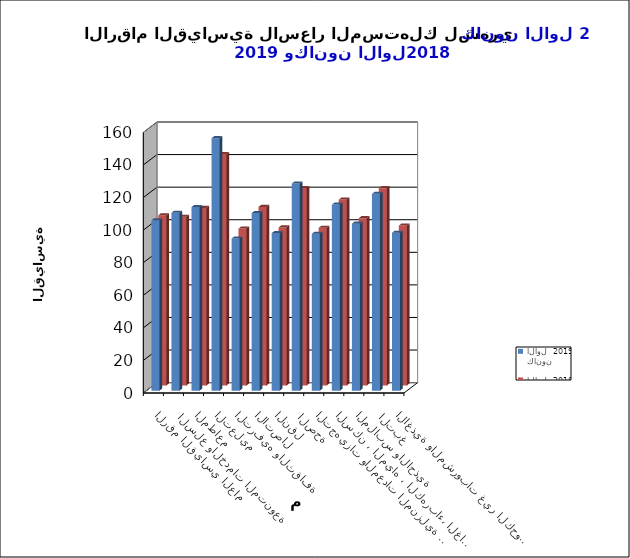
| Category | كانون الاول  2019      |  كانون الاول  2018 |
|---|---|---|
| الاغذية والمشروبات غير الكحولية | 96.9 | 98.2 |
|  التبغ | 120.8 | 121.1 |
| الملابس والاحذية | 102.5 | 102.7 |
| السكن ، المياه ، الكهرباء، الغاز  | 114.2 | 114.1 |
| التجهيزات والمعدات المنزلية والصيانة | 96.3 | 96.8 |
|  الصحة | 127.1 | 121.2 |
| النقل | 96.7 | 97 |
| الاتصال | 109 | 109.6 |
| الترفيه والثقافة | 93.4 | 96.3 |
| التعليم | 155 | 142.1 |
| المطاعم  | 112.7 | 109 |
|  السلع والخدمات المتنوعة | 109.2 | 103.5 |
| الرقم القياسي العام | 104.6 | 104.5 |